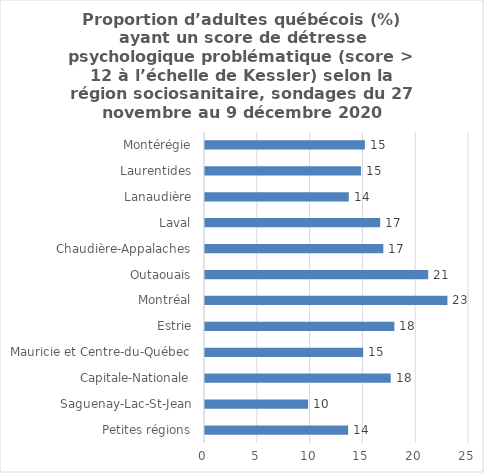
| Category | % |
|---|---|
| Petites régions | 13.555 |
| Saguenay-Lac-St-Jean | 9.764 |
| Capitale-Nationale | 17.59 |
| Mauricie et Centre-du-Québec | 14.979 |
| Estrie | 17.934 |
| Montréal | 22.958 |
| Outaouais | 21.138 |
| Chaudière-Appalaches | 16.887 |
| Laval | 16.589 |
| Lanaudière | 13.619 |
| Laurentides | 14.771 |
| Montérégie | 15.14 |